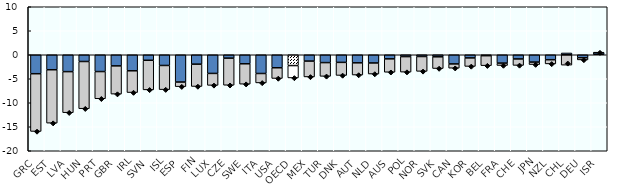
| Category | Cyclical | Structural |
|---|---|---|
| GRC | -3.951 | -12.028 |
| EST | -3.123 | -11.122 |
| LVA | -3.518 | -8.555 |
| HUN | -1.404 | -9.836 |
| PRT | -3.5 | -5.667 |
| GBR | -2.322 | -5.872 |
| IRL | -3.342 | -4.534 |
| SVN | -1.147 | -6.168 |
| ISL | -2.231 | -5.033 |
| ESP | -5.686 | -0.959 |
| FIN | -1.958 | -4.654 |
| LUX | -3.887 | -2.491 |
| CZE | -0.704 | -5.647 |
| SWE | -1.882 | -4.245 |
| ITA | -3.903 | -1.96 |
| USA | -2.71 | -2.23 |
| OECD | -2.251 | -2.577 |
| MEX | -1.318 | -3.3 |
| TUR | -1.636 | -2.861 |
| DNK | -1.586 | -2.722 |
| AUT | -1.685 | -2.538 |
| NLD | -1.714 | -2.299 |
| AUS | -0.859 | -2.786 |
| POL | -0.384 | -3.23 |
| NOR | -0.368 | -3.091 |
| SVK | -0.432 | -2.439 |
| CAN | -1.916 | -0.882 |
| KOR | -0.662 | -1.768 |
| BEL | -0.194 | -2.078 |
| FRA | -1.739 | -0.495 |
| CHE | -0.879 | -1.34 |
| JPN | -1.528 | -0.518 |
| NZL | -1.033 | -0.869 |
| CHL | 0.375 | -2.163 |
| DEU | -0.616 | -0.454 |
| ISR | 0.435 | 0.013 |